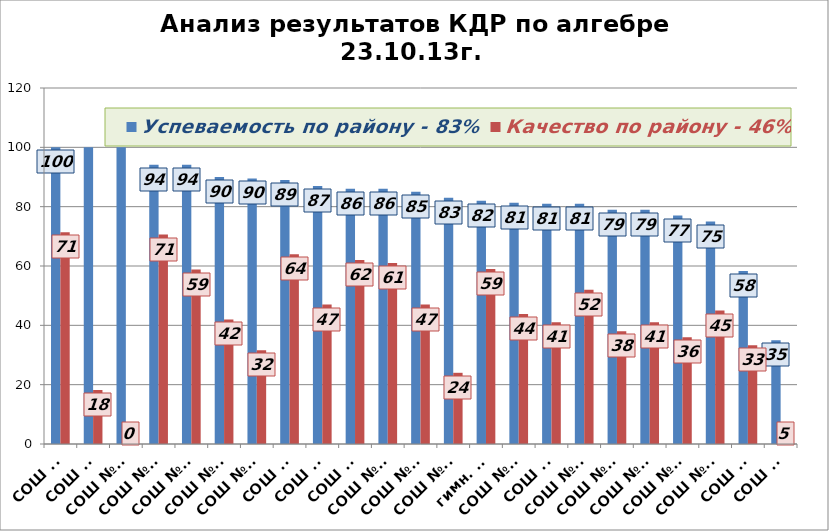
| Category | Успеваемость по району - 83% | Качество по району - 46% |
|---|---|---|
| СОШ №1 | 100 | 71.4 |
| СОШ №4 | 100 | 18.2 |
| СОШ №23 | 100 | 0 |
| СОШ №16 | 94.1 | 70.6 |
| СОШ №22 | 94.1 | 58.8 |
| СОШ №20 | 90 | 42 |
| СОШ №14 | 89.5 | 31.6 |
| СОШ №3 | 89 | 64 |
| СОШ №6 | 87 | 47 |
| СОШ №2 | 86 | 62 |
| СОШ №10 | 86 | 61 |
| СОШ №25 | 85 | 47 |
| СОШ №36 | 83 | 24 |
| гимн. №5 | 82 | 59 |
| СОШ №24 | 81.3 | 43.8 |
| СОШ №7 | 81 | 41 |
| СОШ №13 | 81 | 52 |
| СОШ №12 | 79 | 38 |
| СОШ №19 | 79 | 41 |
| СОШ №11 | 77 | 36 |
| СОШ №15 | 75 | 45 |
| СОШ №8 | 58.3 | 33.3 |
| СОШ №9 | 35 | 5 |